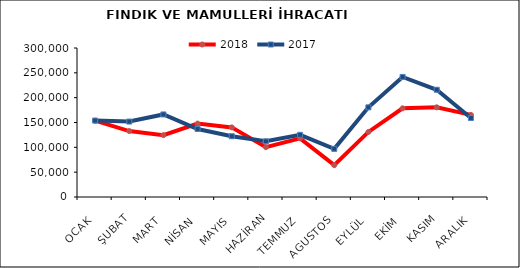
| Category | 2018 | 2017 |
|---|---|---|
| OCAK | 153621.372 | 153847.917 |
| ŞUBAT | 132753.501 | 151901.18 |
| MART | 124563.13 | 166205.429 |
| NİSAN | 147757.615 | 136966.568 |
| MAYIS | 140152.845 | 122369.906 |
| HAZİRAN | 100407.55 | 112166.458 |
| TEMMUZ | 118157.476 | 125186.79 |
| AGUSTOS | 64145.92 | 96913.547 |
| EYLÜL | 131002.983 | 180510.329 |
| EKİM | 178521.168 | 241707.403 |
| KASIM | 180536.692 | 215916.21 |
| ARALIK | 165321.246 | 159069.479 |